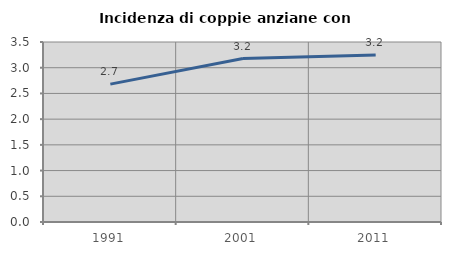
| Category | Incidenza di coppie anziane con figli |
|---|---|
| 1991.0 | 2.681 |
| 2001.0 | 3.177 |
| 2011.0 | 3.249 |